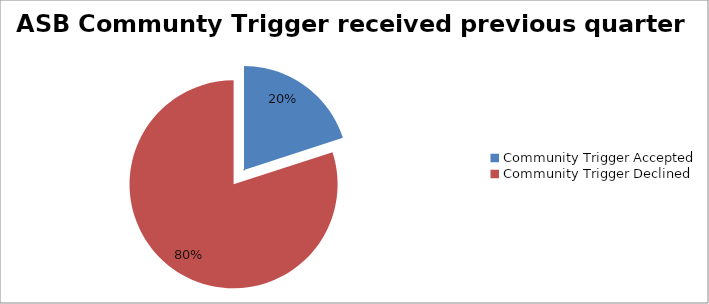
| Category | Series 0 |
|---|---|
| Community Trigger Accepted | 1 |
| Community Trigger Declined | 4 |